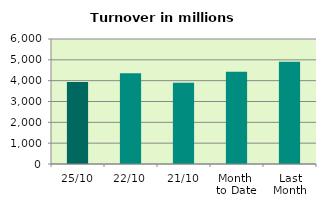
| Category | Series 0 |
|---|---|
| 25/10 | 3939.255 |
| 22/10 | 4356.414 |
| 21/10 | 3899.858 |
| Month 
to Date | 4428.338 |
| Last
Month | 4910.879 |